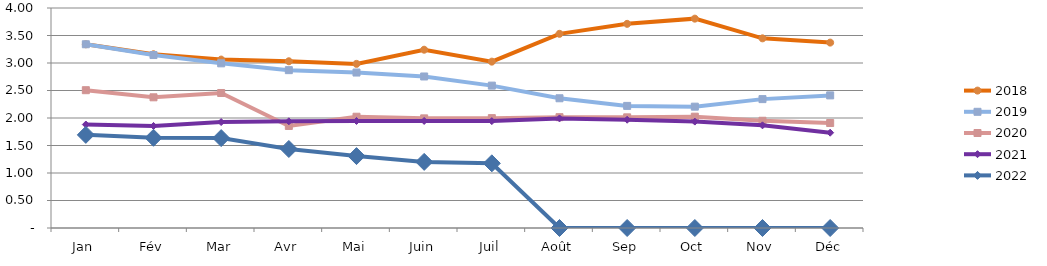
| Category | 2018 | 2019 | 2020 | 2021 | 2022 |
|---|---|---|---|---|---|
| Jan | 3.34 | 3.341 | 2.506 | 1.881 | 1.693 |
| Fév | 3.159 | 3.145 | 2.376 | 1.856 | 1.64 |
| Mar | 3.062 | 2.994 | 2.455 | 1.926 | 1.635 |
| Avr | 3.031 | 2.87 | 1.855 | 1.939 | 1.437 |
| Mai | 2.984 | 2.827 | 2.023 | 1.946 | 1.307 |
| Juin | 3.242 | 2.755 | 1.993 | 1.947 | 1.202 |
| Juil | 3.025 | 2.589 | 1.998 | 1.943 | 1.176 |
| Août | 3.53 | 2.359 | 2.015 | 1.992 | 0 |
| Sep | 3.712 | 2.22 | 2.012 | 1.968 | 0 |
| Oct | 3.806 | 2.206 | 2.024 | 1.935 | 0 |
| Nov | 3.449 | 2.343 | 1.95 | 1.867 | 0 |
| Déc | 3.371 | 2.411 | 1.909 | 1.733 | 0 |